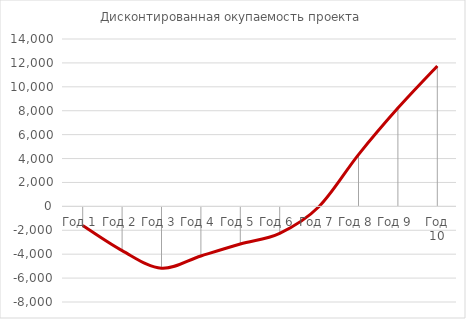
| Category | Дисконтированная окупаемость проекта |
|---|---|
| Год 1 | -1608 |
| Год 2 | -3704.245 |
| Год 3 | -5179.858 |
| Год 4 | -4149.133 |
| Год 5 | -3149.214 |
| Год 6 | -2252.573 |
| Год 7 | -10.386 |
| Год 8 | 4326.738 |
| Год 9 | 8220.001 |
| Год 10 | 11739.271 |